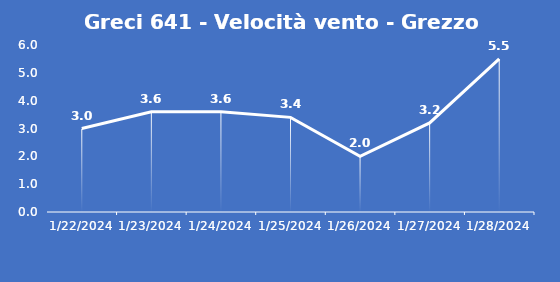
| Category | Greci 641 - Velocità vento - Grezzo (m/s) |
|---|---|
| 1/22/24 | 3 |
| 1/23/24 | 3.6 |
| 1/24/24 | 3.6 |
| 1/25/24 | 3.4 |
| 1/26/24 | 2 |
| 1/27/24 | 3.2 |
| 1/28/24 | 5.5 |